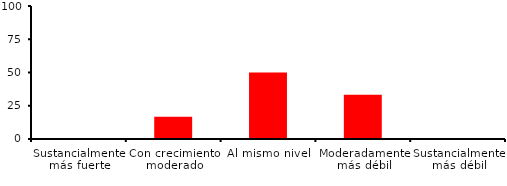
| Category | Series 0 |
|---|---|
| Sustancialmente más fuerte | 0 |
| Con crecimiento moderado | 16.667 |
| Al mismo nivel | 50 |
| Moderadamente más débil | 33.333 |
| Sustancialmente más débil | 0 |